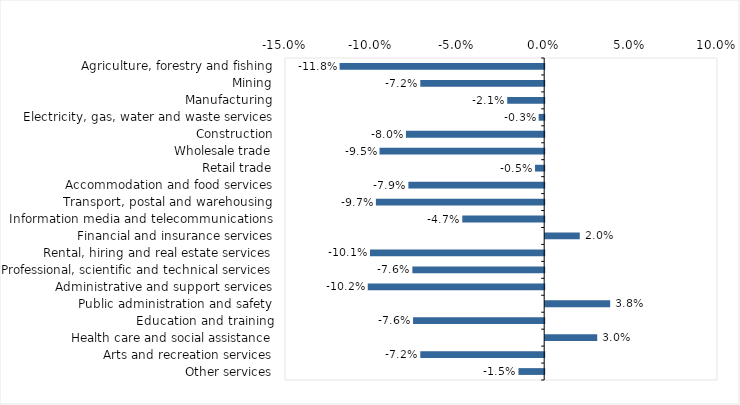
| Category | This week |
|---|---|
| Agriculture, forestry and fishing | -0.118 |
| Mining | -0.072 |
| Manufacturing | -0.021 |
| Electricity, gas, water and waste services | -0.003 |
| Construction | -0.08 |
| Wholesale trade | -0.095 |
| Retail trade | -0.005 |
| Accommodation and food services | -0.079 |
| Transport, postal and warehousing | -0.097 |
| Information media and telecommunications | -0.047 |
| Financial and insurance services | 0.02 |
| Rental, hiring and real estate services | -0.101 |
| Professional, scientific and technical services | -0.076 |
| Administrative and support services | -0.102 |
| Public administration and safety | 0.038 |
| Education and training | -0.076 |
| Health care and social assistance | 0.03 |
| Arts and recreation services | -0.072 |
| Other services | -0.015 |